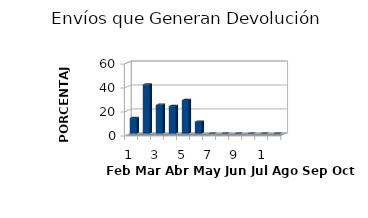
| Category | Series 0 |
|---|---|
| 0 | 13 |
| 1 | 41 |
| 2 | 24 |
| 3 | 23 |
| 4 | 28 |
| 5 | 10 |
| 6 | 0 |
| 7 | 0 |
| 8 | 0 |
| 9 | 0 |
| 10 | 0 |
| 11 | 0 |